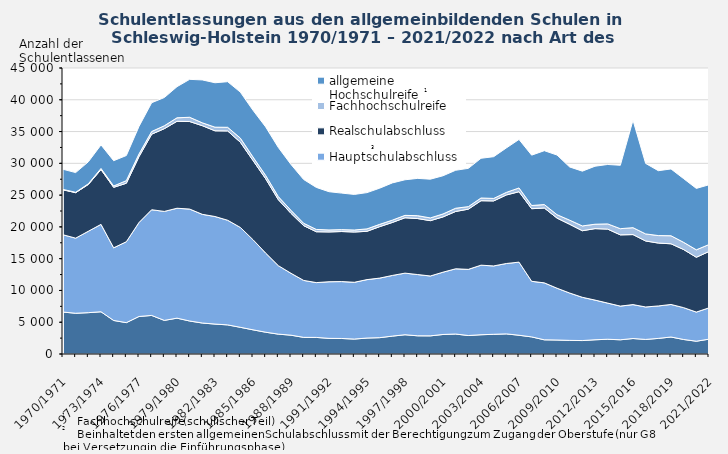
| Category | Ohne Abschluss | Hauptschulabschluss | Realschulabschluss | Fachhochschulreife | allgemeine Hochschulreife |
|---|---|---|---|---|---|
| 1970/1971 | 6600 | 12162 | 7074 | 63 | 3168 |
| 1971/1972 | 6411 | 11817 | 7158 | 57 | 3102 |
| 1972/1973 | 6504 | 12810 | 7365 | 99 | 3462 |
| 1973/1974 | 6645 | 13752 | 8625 | 168 | 3711 |
| 1974/1975 | 5277 | 11430 | 9516 | 213 | 3978 |
| 1975/1976 | 4932 | 12732 | 9201 | 414 | 3948 |
| 1976/1977 | 5904 | 14787 | 10365 | 417 | 4335 |
| 1977/1978 | 6069 | 16632 | 11883 | 423 | 4530 |
| 1978/1979 | 5289 | 17145 | 13020 | 459 | 4440 |
| 1979/1980 | 5640 | 17295 | 13680 | 549 | 4896 |
| 1980/1981 | 5190 | 17613 | 13773 | 672 | 5967 |
| 1981/1982 | 4875 | 17100 | 13947 | 453 | 6747 |
| 1982/1983 | 4710 | 16923 | 13482 | 576 | 6990 |
| 1983/1984 | 4581 | 16464 | 14052 | 573 | 7176 |
| 1984/1985 | 4200 | 15717 | 13407 | 648 | 7233 |
| 1985/1986 | 3804 | 14184 | 12462 | 546 | 7350 |
| 1986/1987 | 3429 | 12453 | 11697 | 519 | 7632 |
| 1987/1988 | 3126 | 10779 | 10377 | 480 | 7734 |
| 1988/1989 | 2961 | 9738 | 9429 | 474 | 7218 |
| 1989/1990 | 2616 | 8964 | 8616 | 372 | 6888 |
| 1990/1991 | 2610 | 8625 | 8001 | 363 | 6612 |
| 1991/1992 | 2460 | 8910 | 7836 | 312 | 6018 |
| 1992/1993 | 2442 | 8955 | 7875 | 297 | 5748 |
| 1993/1994 | 2349 | 8934 | 7911 | 315 | 5601 |
| 1994/1995 | 2511 | 9192 | 7605 | 378 | 5706 |
| 1995/1996 | 2571 | 9372 | 8094 | 363 | 5691 |
| 1996/1997 | 2814 | 9546 | 8337 | 363 | 5859 |
| 1997/1998 | 3030 | 9693 | 8712 | 378 | 5601 |
| 1998/1999 | 2862 | 9639 | 8811 | 450 | 5871 |
| 1999/2000 | 2853 | 9420 | 8706 | 432 | 6096 |
| 2000/2001 | 3072 | 9801 | 8700 | 462 | 6009 |
| 2001/2002 | 3144 | 10263 | 9018 | 510 | 5976 |
| 2002/2003 | 2907 | 10410 | 9474 | 396 | 6024 |
| 2003/2004 | 3030 | 10944 | 10146 | 426 | 6249 |
| 2004/2005 | 3099 | 10758 | 10227 | 393 | 6570 |
| 2005/2006 | 3165 | 11073 | 10785 | 405 | 6993 |
| 2006/2007 | 2952 | 11502 | 11079 | 594 | 7632 |
| 2007/2008 | 2691 | 8748 | 11424 | 501 | 7926 |
| 2008/2009 | 2232 | 8961 | 11778 | 540 | 8481 |
| 2009/2010 | 2202 | 8151 | 11031 | 537 | 9387 |
| 2010/2011 | 2142 | 7452 | 10815 | 651 | 8367 |
| 2011/2012 | 2115 | 6807 | 10473 | 756 | 8616 |
| 2012/2013 | 2238 | 6246 | 11241 | 693 | 9126 |
| 2013/2014 | 2322 | 5688 | 11640 | 822 | 9351 |
| 2014/2015 | 2235 | 5301 | 11208 | 975 | 9972 |
| 2015/2016 | 2436 | 5337 | 11016 | 1089 | 16914 |
| 2016/2017 | 2292 | 5106 | 10386 | 1110 | 11091 |
| 2017/2018 | 2454 | 5106 | 9897 | 1176 | 10209 |
| 2018/2019 | 2673 | 5121 | 9546 | 1266 | 10512 |
| 2019/2020 | 2283 | 5010 | 9141 | 1131 | 10023 |
| 2020/2021 | 2013 | 4581 | 8625 | 1176 | 9660 |
| 2021/2022 | 2334 | 4929 | 8865 | 1098 | 9399 |